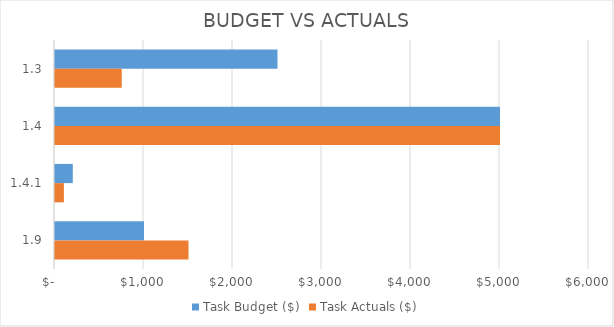
| Category | Task Budget ($) | Task Actuals ($) |
|---|---|---|
| 1.3 | 2500 | 750 |
| 1.4 | 5000 | 5000 |
| 1.4.1 | 200 | 100 |
| 1.9 | 1000 | 1500 |